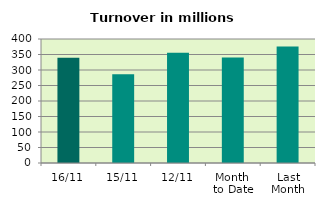
| Category | Series 0 |
|---|---|
| 16/11 | 339.569 |
| 15/11 | 286.593 |
| 12/11 | 355.969 |
| Month 
to Date | 340.241 |
| Last
Month | 375.959 |